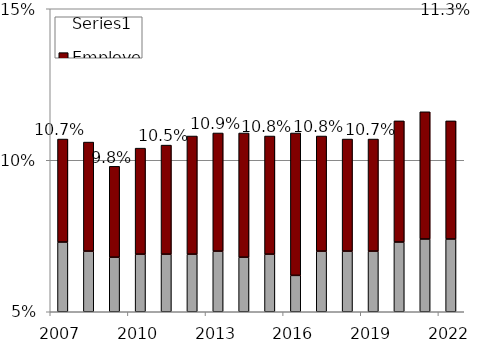
| Category | Employee | Employer  | Series 0 |
|---|---|---|---|
| 2007.0 | 0.073 | 0.034 | 0.107 |
| 2008.0 | 0.07 | 0.036 | 0.106 |
| 2009.0 | 0.068 | 0.03 | 0.098 |
| 2010.0 | 0.069 | 0.035 | 0.104 |
| 2011.0 | 0.069 | 0.036 | 0.105 |
| 2012.0 | 0.069 | 0.039 | 0.108 |
| 2013.0 | 0.07 | 0.039 | 0.109 |
| 2014.0 | 0.068 | 0.041 | 0.109 |
| 2015.0 | 0.069 | 0.039 | 0.108 |
| 2016.0 | 0.062 | 0.047 | 0.109 |
| 2017.0 | 0.07 | 0.038 | 0.108 |
| 2018.0 | 0.07 | 0.037 | 0.107 |
| 2019.0 | 0.07 | 0.037 | 0.107 |
| 2020.0 | 0.073 | 0.04 | 0.113 |
| 2021.0 | 0.074 | 0.042 | 0.116 |
| 2022.0 | 0.074 | 0.039 | 0.113 |